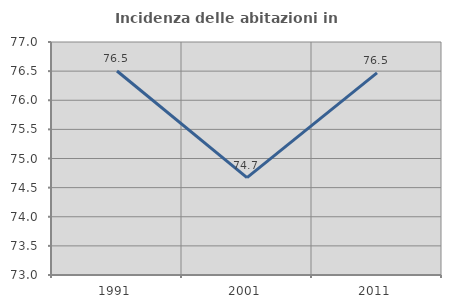
| Category | Incidenza delle abitazioni in proprietà  |
|---|---|
| 1991.0 | 76.503 |
| 2001.0 | 74.672 |
| 2011.0 | 76.471 |